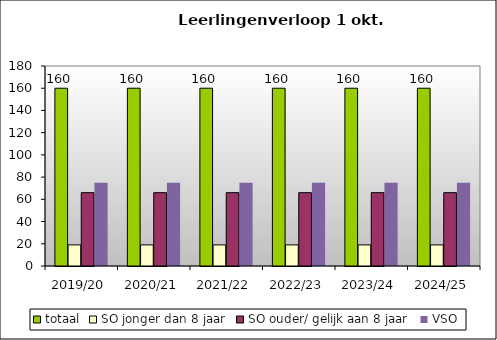
| Category | totaal | SO jonger dan 8 jaar | SO ouder/ gelijk aan 8 jaar | VSO |
|---|---|---|---|---|
| 2019/20 | 160 | 19 | 66 | 75 |
| 2020/21 | 160 | 19 | 66 | 75 |
| 2021/22 | 160 | 19 | 66 | 75 |
| 2022/23 | 160 | 19 | 66 | 75 |
| 2023/24 | 160 | 19 | 66 | 75 |
| 2024/25 | 160 | 19 | 66 | 75 |